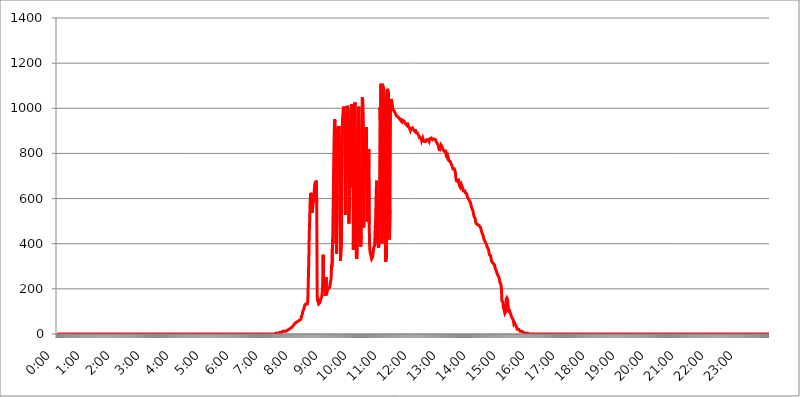
| Category | 2016.12.07. Intenzitás [W/m^2] |
|---|---|
| 0.0 | 0 |
| 0.0006944444444444445 | 0 |
| 0.001388888888888889 | 0 |
| 0.0020833333333333333 | 0 |
| 0.002777777777777778 | 0 |
| 0.003472222222222222 | 0 |
| 0.004166666666666667 | 0 |
| 0.004861111111111111 | 0 |
| 0.005555555555555556 | 0 |
| 0.0062499999999999995 | 0 |
| 0.006944444444444444 | 0 |
| 0.007638888888888889 | 0 |
| 0.008333333333333333 | 0 |
| 0.009027777777777779 | 0 |
| 0.009722222222222222 | 0 |
| 0.010416666666666666 | 0 |
| 0.011111111111111112 | 0 |
| 0.011805555555555555 | 0 |
| 0.012499999999999999 | 0 |
| 0.013194444444444444 | 0 |
| 0.013888888888888888 | 0 |
| 0.014583333333333332 | 0 |
| 0.015277777777777777 | 0 |
| 0.015972222222222224 | 0 |
| 0.016666666666666666 | 0 |
| 0.017361111111111112 | 0 |
| 0.018055555555555557 | 0 |
| 0.01875 | 0 |
| 0.019444444444444445 | 0 |
| 0.02013888888888889 | 0 |
| 0.020833333333333332 | 0 |
| 0.02152777777777778 | 0 |
| 0.022222222222222223 | 0 |
| 0.02291666666666667 | 0 |
| 0.02361111111111111 | 0 |
| 0.024305555555555556 | 0 |
| 0.024999999999999998 | 0 |
| 0.025694444444444447 | 0 |
| 0.02638888888888889 | 0 |
| 0.027083333333333334 | 0 |
| 0.027777777777777776 | 0 |
| 0.02847222222222222 | 0 |
| 0.029166666666666664 | 0 |
| 0.029861111111111113 | 0 |
| 0.030555555555555555 | 0 |
| 0.03125 | 0 |
| 0.03194444444444445 | 0 |
| 0.03263888888888889 | 0 |
| 0.03333333333333333 | 0 |
| 0.034027777777777775 | 0 |
| 0.034722222222222224 | 0 |
| 0.035416666666666666 | 0 |
| 0.036111111111111115 | 0 |
| 0.03680555555555556 | 0 |
| 0.0375 | 0 |
| 0.03819444444444444 | 0 |
| 0.03888888888888889 | 0 |
| 0.03958333333333333 | 0 |
| 0.04027777777777778 | 0 |
| 0.04097222222222222 | 0 |
| 0.041666666666666664 | 0 |
| 0.042361111111111106 | 0 |
| 0.04305555555555556 | 0 |
| 0.043750000000000004 | 0 |
| 0.044444444444444446 | 0 |
| 0.04513888888888889 | 0 |
| 0.04583333333333334 | 0 |
| 0.04652777777777778 | 0 |
| 0.04722222222222222 | 0 |
| 0.04791666666666666 | 0 |
| 0.04861111111111111 | 0 |
| 0.049305555555555554 | 0 |
| 0.049999999999999996 | 0 |
| 0.05069444444444445 | 0 |
| 0.051388888888888894 | 0 |
| 0.052083333333333336 | 0 |
| 0.05277777777777778 | 0 |
| 0.05347222222222222 | 0 |
| 0.05416666666666667 | 0 |
| 0.05486111111111111 | 0 |
| 0.05555555555555555 | 0 |
| 0.05625 | 0 |
| 0.05694444444444444 | 0 |
| 0.057638888888888885 | 0 |
| 0.05833333333333333 | 0 |
| 0.05902777777777778 | 0 |
| 0.059722222222222225 | 0 |
| 0.06041666666666667 | 0 |
| 0.061111111111111116 | 0 |
| 0.06180555555555556 | 0 |
| 0.0625 | 0 |
| 0.06319444444444444 | 0 |
| 0.06388888888888888 | 0 |
| 0.06458333333333334 | 0 |
| 0.06527777777777778 | 0 |
| 0.06597222222222222 | 0 |
| 0.06666666666666667 | 0 |
| 0.06736111111111111 | 0 |
| 0.06805555555555555 | 0 |
| 0.06874999999999999 | 0 |
| 0.06944444444444443 | 0 |
| 0.07013888888888889 | 0 |
| 0.07083333333333333 | 0 |
| 0.07152777777777779 | 0 |
| 0.07222222222222223 | 0 |
| 0.07291666666666667 | 0 |
| 0.07361111111111111 | 0 |
| 0.07430555555555556 | 0 |
| 0.075 | 0 |
| 0.07569444444444444 | 0 |
| 0.0763888888888889 | 0 |
| 0.07708333333333334 | 0 |
| 0.07777777777777778 | 0 |
| 0.07847222222222222 | 0 |
| 0.07916666666666666 | 0 |
| 0.0798611111111111 | 0 |
| 0.08055555555555556 | 0 |
| 0.08125 | 0 |
| 0.08194444444444444 | 0 |
| 0.08263888888888889 | 0 |
| 0.08333333333333333 | 0 |
| 0.08402777777777777 | 0 |
| 0.08472222222222221 | 0 |
| 0.08541666666666665 | 0 |
| 0.08611111111111112 | 0 |
| 0.08680555555555557 | 0 |
| 0.08750000000000001 | 0 |
| 0.08819444444444445 | 0 |
| 0.08888888888888889 | 0 |
| 0.08958333333333333 | 0 |
| 0.09027777777777778 | 0 |
| 0.09097222222222222 | 0 |
| 0.09166666666666667 | 0 |
| 0.09236111111111112 | 0 |
| 0.09305555555555556 | 0 |
| 0.09375 | 0 |
| 0.09444444444444444 | 0 |
| 0.09513888888888888 | 0 |
| 0.09583333333333333 | 0 |
| 0.09652777777777777 | 0 |
| 0.09722222222222222 | 0 |
| 0.09791666666666667 | 0 |
| 0.09861111111111111 | 0 |
| 0.09930555555555555 | 0 |
| 0.09999999999999999 | 0 |
| 0.10069444444444443 | 0 |
| 0.1013888888888889 | 0 |
| 0.10208333333333335 | 0 |
| 0.10277777777777779 | 0 |
| 0.10347222222222223 | 0 |
| 0.10416666666666667 | 0 |
| 0.10486111111111111 | 0 |
| 0.10555555555555556 | 0 |
| 0.10625 | 0 |
| 0.10694444444444444 | 0 |
| 0.1076388888888889 | 0 |
| 0.10833333333333334 | 0 |
| 0.10902777777777778 | 0 |
| 0.10972222222222222 | 0 |
| 0.1111111111111111 | 0 |
| 0.11180555555555556 | 0 |
| 0.11180555555555556 | 0 |
| 0.1125 | 0 |
| 0.11319444444444444 | 0 |
| 0.11388888888888889 | 0 |
| 0.11458333333333333 | 0 |
| 0.11527777777777777 | 0 |
| 0.11597222222222221 | 0 |
| 0.11666666666666665 | 0 |
| 0.1173611111111111 | 0 |
| 0.11805555555555557 | 0 |
| 0.11944444444444445 | 0 |
| 0.12013888888888889 | 0 |
| 0.12083333333333333 | 0 |
| 0.12152777777777778 | 0 |
| 0.12222222222222223 | 0 |
| 0.12291666666666667 | 0 |
| 0.12291666666666667 | 0 |
| 0.12361111111111112 | 0 |
| 0.12430555555555556 | 0 |
| 0.125 | 0 |
| 0.12569444444444444 | 0 |
| 0.12638888888888888 | 0 |
| 0.12708333333333333 | 0 |
| 0.16875 | 0 |
| 0.12847222222222224 | 0 |
| 0.12916666666666668 | 0 |
| 0.12986111111111112 | 0 |
| 0.13055555555555556 | 0 |
| 0.13125 | 0 |
| 0.13194444444444445 | 0 |
| 0.1326388888888889 | 0 |
| 0.13333333333333333 | 0 |
| 0.13402777777777777 | 0 |
| 0.13402777777777777 | 0 |
| 0.13472222222222222 | 0 |
| 0.13541666666666666 | 0 |
| 0.1361111111111111 | 0 |
| 0.13749999999999998 | 0 |
| 0.13819444444444443 | 0 |
| 0.1388888888888889 | 0 |
| 0.13958333333333334 | 0 |
| 0.14027777777777778 | 0 |
| 0.14097222222222222 | 0 |
| 0.14166666666666666 | 0 |
| 0.1423611111111111 | 0 |
| 0.14305555555555557 | 0 |
| 0.14375000000000002 | 0 |
| 0.14444444444444446 | 0 |
| 0.1451388888888889 | 0 |
| 0.1451388888888889 | 0 |
| 0.14652777777777778 | 0 |
| 0.14722222222222223 | 0 |
| 0.14791666666666667 | 0 |
| 0.1486111111111111 | 0 |
| 0.14930555555555555 | 0 |
| 0.15 | 0 |
| 0.15069444444444444 | 0 |
| 0.15138888888888888 | 0 |
| 0.15208333333333332 | 0 |
| 0.15277777777777776 | 0 |
| 0.15347222222222223 | 0 |
| 0.15416666666666667 | 0 |
| 0.15486111111111112 | 0 |
| 0.15555555555555556 | 0 |
| 0.15625 | 0 |
| 0.15694444444444444 | 0 |
| 0.15763888888888888 | 0 |
| 0.15833333333333333 | 0 |
| 0.15902777777777777 | 0 |
| 0.15972222222222224 | 0 |
| 0.16041666666666668 | 0 |
| 0.16111111111111112 | 0 |
| 0.16180555555555556 | 0 |
| 0.1625 | 0 |
| 0.16319444444444445 | 0 |
| 0.1638888888888889 | 0 |
| 0.16458333333333333 | 0 |
| 0.16527777777777777 | 0 |
| 0.16597222222222222 | 0 |
| 0.16666666666666666 | 0 |
| 0.1673611111111111 | 0 |
| 0.16805555555555554 | 0 |
| 0.16874999999999998 | 0 |
| 0.16944444444444443 | 0 |
| 0.17013888888888887 | 0 |
| 0.1708333333333333 | 0 |
| 0.17152777777777775 | 0 |
| 0.17222222222222225 | 0 |
| 0.1729166666666667 | 0 |
| 0.17361111111111113 | 0 |
| 0.17430555555555557 | 0 |
| 0.17500000000000002 | 0 |
| 0.17569444444444446 | 0 |
| 0.1763888888888889 | 0 |
| 0.17708333333333334 | 0 |
| 0.17777777777777778 | 0 |
| 0.17847222222222223 | 0 |
| 0.17916666666666667 | 0 |
| 0.1798611111111111 | 0 |
| 0.18055555555555555 | 0 |
| 0.18125 | 0 |
| 0.18194444444444444 | 0 |
| 0.1826388888888889 | 0 |
| 0.18333333333333335 | 0 |
| 0.1840277777777778 | 0 |
| 0.18472222222222223 | 0 |
| 0.18541666666666667 | 0 |
| 0.18611111111111112 | 0 |
| 0.18680555555555556 | 0 |
| 0.1875 | 0 |
| 0.18819444444444444 | 0 |
| 0.18888888888888888 | 0 |
| 0.18958333333333333 | 0 |
| 0.19027777777777777 | 0 |
| 0.1909722222222222 | 0 |
| 0.19166666666666665 | 0 |
| 0.19236111111111112 | 0 |
| 0.19305555555555554 | 0 |
| 0.19375 | 0 |
| 0.19444444444444445 | 0 |
| 0.1951388888888889 | 0 |
| 0.19583333333333333 | 0 |
| 0.19652777777777777 | 0 |
| 0.19722222222222222 | 0 |
| 0.19791666666666666 | 0 |
| 0.1986111111111111 | 0 |
| 0.19930555555555554 | 0 |
| 0.19999999999999998 | 0 |
| 0.20069444444444443 | 0 |
| 0.20138888888888887 | 0 |
| 0.2020833333333333 | 0 |
| 0.2027777777777778 | 0 |
| 0.2034722222222222 | 0 |
| 0.2041666666666667 | 0 |
| 0.20486111111111113 | 0 |
| 0.20555555555555557 | 0 |
| 0.20625000000000002 | 0 |
| 0.20694444444444446 | 0 |
| 0.2076388888888889 | 0 |
| 0.20833333333333334 | 0 |
| 0.20902777777777778 | 0 |
| 0.20972222222222223 | 0 |
| 0.21041666666666667 | 0 |
| 0.2111111111111111 | 0 |
| 0.21180555555555555 | 0 |
| 0.2125 | 0 |
| 0.21319444444444444 | 0 |
| 0.2138888888888889 | 0 |
| 0.21458333333333335 | 0 |
| 0.2152777777777778 | 0 |
| 0.21597222222222223 | 0 |
| 0.21666666666666667 | 0 |
| 0.21736111111111112 | 0 |
| 0.21805555555555556 | 0 |
| 0.21875 | 0 |
| 0.21944444444444444 | 0 |
| 0.22013888888888888 | 0 |
| 0.22083333333333333 | 0 |
| 0.22152777777777777 | 0 |
| 0.2222222222222222 | 0 |
| 0.22291666666666665 | 0 |
| 0.2236111111111111 | 0 |
| 0.22430555555555556 | 0 |
| 0.225 | 0 |
| 0.22569444444444445 | 0 |
| 0.2263888888888889 | 0 |
| 0.22708333333333333 | 0 |
| 0.22777777777777777 | 0 |
| 0.22847222222222222 | 0 |
| 0.22916666666666666 | 0 |
| 0.2298611111111111 | 0 |
| 0.23055555555555554 | 0 |
| 0.23124999999999998 | 0 |
| 0.23194444444444443 | 0 |
| 0.23263888888888887 | 0 |
| 0.2333333333333333 | 0 |
| 0.2340277777777778 | 0 |
| 0.2347222222222222 | 0 |
| 0.2354166666666667 | 0 |
| 0.23611111111111113 | 0 |
| 0.23680555555555557 | 0 |
| 0.23750000000000002 | 0 |
| 0.23819444444444446 | 0 |
| 0.2388888888888889 | 0 |
| 0.23958333333333334 | 0 |
| 0.24027777777777778 | 0 |
| 0.24097222222222223 | 0 |
| 0.24166666666666667 | 0 |
| 0.2423611111111111 | 0 |
| 0.24305555555555555 | 0 |
| 0.24375 | 0 |
| 0.24444444444444446 | 0 |
| 0.24513888888888888 | 0 |
| 0.24583333333333335 | 0 |
| 0.2465277777777778 | 0 |
| 0.24722222222222223 | 0 |
| 0.24791666666666667 | 0 |
| 0.24861111111111112 | 0 |
| 0.24930555555555556 | 0 |
| 0.25 | 0 |
| 0.25069444444444444 | 0 |
| 0.2513888888888889 | 0 |
| 0.2520833333333333 | 0 |
| 0.25277777777777777 | 0 |
| 0.2534722222222222 | 0 |
| 0.25416666666666665 | 0 |
| 0.2548611111111111 | 0 |
| 0.2555555555555556 | 0 |
| 0.25625000000000003 | 0 |
| 0.2569444444444445 | 0 |
| 0.2576388888888889 | 0 |
| 0.25833333333333336 | 0 |
| 0.2590277777777778 | 0 |
| 0.25972222222222224 | 0 |
| 0.2604166666666667 | 0 |
| 0.2611111111111111 | 0 |
| 0.26180555555555557 | 0 |
| 0.2625 | 0 |
| 0.26319444444444445 | 0 |
| 0.2638888888888889 | 0 |
| 0.26458333333333334 | 0 |
| 0.2652777777777778 | 0 |
| 0.2659722222222222 | 0 |
| 0.26666666666666666 | 0 |
| 0.2673611111111111 | 0 |
| 0.26805555555555555 | 0 |
| 0.26875 | 0 |
| 0.26944444444444443 | 0 |
| 0.2701388888888889 | 0 |
| 0.2708333333333333 | 0 |
| 0.27152777777777776 | 0 |
| 0.2722222222222222 | 0 |
| 0.27291666666666664 | 0 |
| 0.2736111111111111 | 0 |
| 0.2743055555555555 | 0 |
| 0.27499999999999997 | 0 |
| 0.27569444444444446 | 0 |
| 0.27638888888888885 | 0 |
| 0.27708333333333335 | 0 |
| 0.2777777777777778 | 0 |
| 0.27847222222222223 | 0 |
| 0.2791666666666667 | 0 |
| 0.2798611111111111 | 0 |
| 0.28055555555555556 | 0 |
| 0.28125 | 0 |
| 0.28194444444444444 | 0 |
| 0.2826388888888889 | 0 |
| 0.2833333333333333 | 0 |
| 0.28402777777777777 | 0 |
| 0.2847222222222222 | 0 |
| 0.28541666666666665 | 0 |
| 0.28611111111111115 | 0 |
| 0.28680555555555554 | 0 |
| 0.28750000000000003 | 0 |
| 0.2881944444444445 | 0 |
| 0.2888888888888889 | 0 |
| 0.28958333333333336 | 0 |
| 0.2902777777777778 | 0 |
| 0.29097222222222224 | 0 |
| 0.2916666666666667 | 0 |
| 0.2923611111111111 | 0 |
| 0.29305555555555557 | 0 |
| 0.29375 | 0 |
| 0.29444444444444445 | 0 |
| 0.2951388888888889 | 0 |
| 0.29583333333333334 | 0 |
| 0.2965277777777778 | 0 |
| 0.2972222222222222 | 0 |
| 0.29791666666666666 | 0 |
| 0.2986111111111111 | 0 |
| 0.29930555555555555 | 0 |
| 0.3 | 0 |
| 0.30069444444444443 | 0 |
| 0.3013888888888889 | 0 |
| 0.3020833333333333 | 0 |
| 0.30277777777777776 | 0 |
| 0.3034722222222222 | 0 |
| 0.30416666666666664 | 0 |
| 0.3048611111111111 | 3.525 |
| 0.3055555555555555 | 3.525 |
| 0.30624999999999997 | 3.525 |
| 0.3069444444444444 | 3.525 |
| 0.3076388888888889 | 3.525 |
| 0.30833333333333335 | 3.525 |
| 0.3090277777777778 | 3.525 |
| 0.30972222222222223 | 3.525 |
| 0.3104166666666667 | 3.525 |
| 0.3111111111111111 | 3.525 |
| 0.31180555555555556 | 3.525 |
| 0.3125 | 7.887 |
| 0.31319444444444444 | 7.887 |
| 0.3138888888888889 | 7.887 |
| 0.3145833333333333 | 7.887 |
| 0.31527777777777777 | 12.257 |
| 0.3159722222222222 | 12.257 |
| 0.31666666666666665 | 12.257 |
| 0.31736111111111115 | 12.257 |
| 0.31805555555555554 | 12.257 |
| 0.31875000000000003 | 12.257 |
| 0.3194444444444445 | 12.257 |
| 0.3201388888888889 | 12.257 |
| 0.32083333333333336 | 12.257 |
| 0.3215277777777778 | 16.636 |
| 0.32222222222222224 | 16.636 |
| 0.3229166666666667 | 16.636 |
| 0.3236111111111111 | 21.024 |
| 0.32430555555555557 | 21.024 |
| 0.325 | 21.024 |
| 0.32569444444444445 | 21.024 |
| 0.3263888888888889 | 25.419 |
| 0.32708333333333334 | 25.419 |
| 0.3277777777777778 | 29.823 |
| 0.3284722222222222 | 29.823 |
| 0.32916666666666666 | 29.823 |
| 0.3298611111111111 | 29.823 |
| 0.33055555555555555 | 34.234 |
| 0.33125 | 38.653 |
| 0.33194444444444443 | 38.653 |
| 0.3326388888888889 | 43.079 |
| 0.3333333333333333 | 47.511 |
| 0.3340277777777778 | 47.511 |
| 0.3347222222222222 | 47.511 |
| 0.3354166666666667 | 51.951 |
| 0.3361111111111111 | 51.951 |
| 0.3368055555555556 | 51.951 |
| 0.33749999999999997 | 56.398 |
| 0.33819444444444446 | 56.398 |
| 0.33888888888888885 | 56.398 |
| 0.33958333333333335 | 60.85 |
| 0.34027777777777773 | 60.85 |
| 0.34097222222222223 | 60.85 |
| 0.3416666666666666 | 65.31 |
| 0.3423611111111111 | 74.246 |
| 0.3430555555555555 | 83.205 |
| 0.34375 | 87.692 |
| 0.3444444444444445 | 101.184 |
| 0.3451388888888889 | 105.69 |
| 0.3458333333333334 | 110.201 |
| 0.34652777777777777 | 119.235 |
| 0.34722222222222227 | 128.284 |
| 0.34791666666666665 | 128.284 |
| 0.34861111111111115 | 132.814 |
| 0.34930555555555554 | 132.814 |
| 0.35000000000000003 | 132.814 |
| 0.3506944444444444 | 132.814 |
| 0.3513888888888889 | 146.423 |
| 0.3520833333333333 | 233 |
| 0.3527777777777778 | 324.052 |
| 0.3534722222222222 | 449.551 |
| 0.3541666666666667 | 515.223 |
| 0.3548611111111111 | 600.661 |
| 0.35555555555555557 | 625.784 |
| 0.35625 | 625.784 |
| 0.35694444444444445 | 604.864 |
| 0.3576388888888889 | 536.82 |
| 0.35833333333333334 | 566.793 |
| 0.3590277777777778 | 571.049 |
| 0.3597222222222222 | 592.233 |
| 0.36041666666666666 | 634.105 |
| 0.3611111111111111 | 658.909 |
| 0.36180555555555555 | 671.22 |
| 0.3625 | 663.019 |
| 0.36319444444444443 | 679.395 |
| 0.3638888888888889 | 583.779 |
| 0.3645833333333333 | 169.156 |
| 0.3652777777777778 | 146.423 |
| 0.3659722222222222 | 141.884 |
| 0.3666666666666667 | 132.814 |
| 0.3673611111111111 | 132.814 |
| 0.3680555555555556 | 137.347 |
| 0.36874999999999997 | 141.884 |
| 0.36944444444444446 | 155.509 |
| 0.37013888888888885 | 160.056 |
| 0.37083333333333335 | 164.605 |
| 0.37152777777777773 | 178.264 |
| 0.37222222222222223 | 219.309 |
| 0.3729166666666666 | 351.198 |
| 0.3736111111111111 | 233 |
| 0.3743055555555555 | 233 |
| 0.375 | 219.309 |
| 0.3756944444444445 | 169.156 |
| 0.3763888888888889 | 191.937 |
| 0.3770833333333334 | 251.251 |
| 0.37777777777777777 | 191.937 |
| 0.37847222222222227 | 187.378 |
| 0.37916666666666665 | 196.497 |
| 0.37986111111111115 | 201.058 |
| 0.38055555555555554 | 201.058 |
| 0.38125000000000003 | 201.058 |
| 0.3819444444444444 | 205.62 |
| 0.3826388888888889 | 219.309 |
| 0.3833333333333333 | 233 |
| 0.3840277777777778 | 242.127 |
| 0.3847222222222222 | 305.898 |
| 0.3854166666666667 | 296.808 |
| 0.3861111111111111 | 418.492 |
| 0.38680555555555557 | 400.638 |
| 0.3875 | 699.717 |
| 0.38819444444444445 | 845.365 |
| 0.3888888888888889 | 951.327 |
| 0.38958333333333334 | 943.832 |
| 0.3902777777777778 | 898.668 |
| 0.3909722222222222 | 575.299 |
| 0.39166666666666666 | 355.712 |
| 0.3923611111111111 | 621.613 |
| 0.39305555555555555 | 783.342 |
| 0.39375 | 909.996 |
| 0.39444444444444443 | 894.885 |
| 0.3951388888888889 | 921.298 |
| 0.3958333333333333 | 810.641 |
| 0.3965277777777778 | 506.542 |
| 0.3972222222222222 | 324.052 |
| 0.3979166666666667 | 324.052 |
| 0.3986111111111111 | 422.943 |
| 0.3993055555555556 | 703.762 |
| 0.39999999999999997 | 947.58 |
| 0.40069444444444446 | 973.772 |
| 0.40138888888888885 | 1007.383 |
| 0.40208333333333335 | 999.916 |
| 0.40277777777777773 | 973.772 |
| 0.40347222222222223 | 829.981 |
| 0.4041666666666666 | 528.2 |
| 0.4048611111111111 | 829.981 |
| 0.4055555555555555 | 917.534 |
| 0.40625 | 1011.118 |
| 0.4069444444444445 | 1011.118 |
| 0.4076388888888889 | 999.916 |
| 0.4083333333333334 | 810.641 |
| 0.40902777777777777 | 489.108 |
| 0.40972222222222227 | 604.864 |
| 0.41041666666666665 | 751.803 |
| 0.41111111111111115 | 650.667 |
| 0.41180555555555554 | 992.448 |
| 0.41250000000000003 | 1018.587 |
| 0.4131944444444444 | 999.916 |
| 0.4138888888888889 | 1018.587 |
| 0.4145833333333333 | 802.868 |
| 0.4152777777777778 | 373.729 |
| 0.4159722222222222 | 600.661 |
| 0.4166666666666667 | 984.98 |
| 0.4173611111111111 | 1026.06 |
| 0.41805555555555557 | 1018.587 |
| 0.41875 | 506.542 |
| 0.41944444444444445 | 342.162 |
| 0.4201388888888889 | 333.113 |
| 0.42083333333333334 | 427.39 |
| 0.4215277777777778 | 571.049 |
| 0.4222222222222222 | 936.33 |
| 0.42291666666666666 | 1007.383 |
| 0.4236111111111111 | 853.029 |
| 0.42430555555555555 | 427.39 |
| 0.425 | 396.164 |
| 0.42569444444444443 | 387.202 |
| 0.4263888888888889 | 436.27 |
| 0.4270833333333333 | 767.62 |
| 0.4277777777777778 | 1048.508 |
| 0.4284722222222222 | 1037.277 |
| 0.4291666666666667 | 958.814 |
| 0.4298611111111111 | 471.582 |
| 0.4305555555555556 | 707.8 |
| 0.43124999999999997 | 891.099 |
| 0.43194444444444446 | 818.392 |
| 0.43263888888888885 | 727.896 |
| 0.43333333333333335 | 917.534 |
| 0.43402777777777773 | 739.877 |
| 0.43472222222222223 | 497.836 |
| 0.4354166666666666 | 634.105 |
| 0.4361111111111111 | 506.542 |
| 0.4368055555555555 | 818.392 |
| 0.4375 | 489.108 |
| 0.4381944444444445 | 382.715 |
| 0.4388888888888889 | 360.221 |
| 0.4395833333333334 | 351.198 |
| 0.44027777777777777 | 342.162 |
| 0.44097222222222227 | 333.113 |
| 0.44166666666666665 | 333.113 |
| 0.44236111111111115 | 342.162 |
| 0.44305555555555554 | 360.221 |
| 0.44375000000000003 | 382.715 |
| 0.4444444444444444 | 382.715 |
| 0.4451388888888889 | 391.685 |
| 0.4458333333333333 | 458.38 |
| 0.4465277777777778 | 506.542 |
| 0.4472222222222222 | 609.062 |
| 0.4479166666666667 | 679.395 |
| 0.4486111111111111 | 458.38 |
| 0.44930555555555557 | 405.108 |
| 0.45 | 391.685 |
| 0.45069444444444445 | 382.715 |
| 0.4513888888888889 | 418.492 |
| 0.45208333333333334 | 604.864 |
| 0.4527777777777778 | 1003.65 |
| 0.4534722222222222 | 909.996 |
| 0.45416666666666666 | 1108.816 |
| 0.4548611111111111 | 497.836 |
| 0.45555555555555555 | 400.638 |
| 0.45625 | 532.513 |
| 0.45694444444444443 | 1082.324 |
| 0.4576388888888889 | 1089.873 |
| 0.4583333333333333 | 1082.324 |
| 0.4590277777777778 | 1037.277 |
| 0.4597222222222222 | 707.8 |
| 0.4604166666666667 | 319.517 |
| 0.4611111111111111 | 319.517 |
| 0.4618055555555556 | 342.162 |
| 0.46249999999999997 | 731.896 |
| 0.46319444444444446 | 1086.097 |
| 0.46388888888888885 | 1082.324 |
| 0.46458333333333335 | 1063.51 |
| 0.46527777777777773 | 462.786 |
| 0.46597222222222223 | 418.492 |
| 0.4666666666666666 | 553.986 |
| 0.4673611111111111 | 984.98 |
| 0.4680555555555555 | 1041.019 |
| 0.46875 | 1037.277 |
| 0.4694444444444445 | 1026.06 |
| 0.4701388888888889 | 1011.118 |
| 0.4708333333333334 | 996.182 |
| 0.47152777777777777 | 992.448 |
| 0.47222222222222227 | 988.714 |
| 0.47291666666666665 | 984.98 |
| 0.47361111111111115 | 981.244 |
| 0.47430555555555554 | 981.244 |
| 0.47500000000000003 | 977.508 |
| 0.4756944444444444 | 966.295 |
| 0.4763888888888889 | 962.555 |
| 0.4770833333333333 | 966.295 |
| 0.4777777777777778 | 962.555 |
| 0.4784722222222222 | 958.814 |
| 0.4791666666666667 | 958.814 |
| 0.4798611111111111 | 955.071 |
| 0.48055555555555557 | 951.327 |
| 0.48125 | 947.58 |
| 0.48194444444444445 | 951.327 |
| 0.4826388888888889 | 951.327 |
| 0.48333333333333334 | 940.082 |
| 0.4840277777777778 | 947.58 |
| 0.4847222222222222 | 947.58 |
| 0.48541666666666666 | 947.58 |
| 0.4861111111111111 | 943.832 |
| 0.48680555555555555 | 943.832 |
| 0.4875 | 940.082 |
| 0.48819444444444443 | 932.576 |
| 0.4888888888888889 | 936.33 |
| 0.4895833333333333 | 928.819 |
| 0.4902777777777778 | 925.06 |
| 0.4909722222222222 | 936.33 |
| 0.4916666666666667 | 932.576 |
| 0.4923611111111111 | 921.298 |
| 0.4930555555555556 | 917.534 |
| 0.49374999999999997 | 913.766 |
| 0.49444444444444446 | 913.766 |
| 0.49513888888888885 | 902.447 |
| 0.49583333333333335 | 909.996 |
| 0.49652777777777773 | 913.766 |
| 0.49722222222222223 | 913.766 |
| 0.4979166666666666 | 913.766 |
| 0.4986111111111111 | 913.766 |
| 0.4993055555555555 | 906.223 |
| 0.5 | 906.223 |
| 0.5006944444444444 | 902.447 |
| 0.5013888888888889 | 898.668 |
| 0.5020833333333333 | 906.223 |
| 0.5027777777777778 | 894.885 |
| 0.5034722222222222 | 898.668 |
| 0.5041666666666667 | 891.099 |
| 0.5048611111111111 | 891.099 |
| 0.5055555555555555 | 891.099 |
| 0.50625 | 883.516 |
| 0.5069444444444444 | 879.719 |
| 0.5076388888888889 | 879.719 |
| 0.5083333333333333 | 868.305 |
| 0.5090277777777777 | 864.493 |
| 0.5097222222222222 | 864.493 |
| 0.5104166666666666 | 868.305 |
| 0.5111111111111112 | 856.855 |
| 0.5118055555555555 | 853.029 |
| 0.5125000000000001 | 868.305 |
| 0.5131944444444444 | 860.676 |
| 0.513888888888889 | 860.676 |
| 0.5145833333333333 | 853.029 |
| 0.5152777777777778 | 853.029 |
| 0.5159722222222222 | 856.855 |
| 0.5166666666666667 | 853.029 |
| 0.517361111111111 | 856.855 |
| 0.5180555555555556 | 860.676 |
| 0.5187499999999999 | 860.676 |
| 0.5194444444444445 | 864.493 |
| 0.5201388888888888 | 860.676 |
| 0.5208333333333334 | 860.676 |
| 0.5215277777777778 | 853.029 |
| 0.5222222222222223 | 864.493 |
| 0.5229166666666667 | 860.676 |
| 0.5236111111111111 | 868.305 |
| 0.5243055555555556 | 868.305 |
| 0.525 | 868.305 |
| 0.5256944444444445 | 868.305 |
| 0.5263888888888889 | 860.676 |
| 0.5270833333333333 | 860.676 |
| 0.5277777777777778 | 864.493 |
| 0.5284722222222222 | 864.493 |
| 0.5291666666666667 | 860.676 |
| 0.5298611111111111 | 860.676 |
| 0.5305555555555556 | 860.676 |
| 0.53125 | 853.029 |
| 0.5319444444444444 | 849.199 |
| 0.5326388888888889 | 845.365 |
| 0.5333333333333333 | 849.199 |
| 0.5340277777777778 | 837.682 |
| 0.5347222222222222 | 829.981 |
| 0.5354166666666667 | 829.981 |
| 0.5361111111111111 | 810.641 |
| 0.5368055555555555 | 822.26 |
| 0.5375 | 829.981 |
| 0.5381944444444444 | 837.682 |
| 0.5388888888888889 | 833.834 |
| 0.5395833333333333 | 829.981 |
| 0.5402777777777777 | 822.26 |
| 0.5409722222222222 | 818.392 |
| 0.5416666666666666 | 818.392 |
| 0.5423611111111112 | 810.641 |
| 0.5430555555555555 | 806.757 |
| 0.5437500000000001 | 814.519 |
| 0.5444444444444444 | 810.641 |
| 0.545138888888889 | 798.974 |
| 0.5458333333333333 | 787.258 |
| 0.5465277777777778 | 783.342 |
| 0.5472222222222222 | 779.42 |
| 0.5479166666666667 | 787.258 |
| 0.548611111111111 | 779.42 |
| 0.5493055555555556 | 767.62 |
| 0.5499999999999999 | 763.674 |
| 0.5506944444444445 | 767.62 |
| 0.5513888888888888 | 763.674 |
| 0.5520833333333334 | 755.766 |
| 0.5527777777777778 | 751.803 |
| 0.5534722222222223 | 747.834 |
| 0.5541666666666667 | 739.877 |
| 0.5548611111111111 | 731.896 |
| 0.5555555555555556 | 735.89 |
| 0.55625 | 735.89 |
| 0.5569444444444445 | 731.896 |
| 0.5576388888888889 | 727.896 |
| 0.5583333333333333 | 715.858 |
| 0.5590277777777778 | 695.666 |
| 0.5597222222222222 | 679.395 |
| 0.5604166666666667 | 683.473 |
| 0.5611111111111111 | 675.311 |
| 0.5618055555555556 | 675.311 |
| 0.5625 | 687.544 |
| 0.5631944444444444 | 675.311 |
| 0.5638888888888889 | 658.909 |
| 0.5645833333333333 | 658.909 |
| 0.5652777777777778 | 650.667 |
| 0.5659722222222222 | 650.667 |
| 0.5666666666666667 | 663.019 |
| 0.5673611111111111 | 658.909 |
| 0.5680555555555555 | 650.667 |
| 0.56875 | 642.4 |
| 0.5694444444444444 | 634.105 |
| 0.5701388888888889 | 638.256 |
| 0.5708333333333333 | 634.105 |
| 0.5715277777777777 | 634.105 |
| 0.5722222222222222 | 625.784 |
| 0.5729166666666666 | 621.613 |
| 0.5736111111111112 | 621.613 |
| 0.5743055555555555 | 621.613 |
| 0.5750000000000001 | 609.062 |
| 0.5756944444444444 | 604.864 |
| 0.576388888888889 | 600.661 |
| 0.5770833333333333 | 600.661 |
| 0.5777777777777778 | 592.233 |
| 0.5784722222222222 | 592.233 |
| 0.5791666666666667 | 592.233 |
| 0.579861111111111 | 579.542 |
| 0.5805555555555556 | 566.793 |
| 0.5812499999999999 | 558.261 |
| 0.5819444444444445 | 553.986 |
| 0.5826388888888888 | 549.704 |
| 0.5833333333333334 | 541.121 |
| 0.5840277777777778 | 528.2 |
| 0.5847222222222223 | 519.555 |
| 0.5854166666666667 | 515.223 |
| 0.5861111111111111 | 510.885 |
| 0.5868055555555556 | 497.836 |
| 0.5875 | 489.108 |
| 0.5881944444444445 | 489.108 |
| 0.5888888888888889 | 489.108 |
| 0.5895833333333333 | 484.735 |
| 0.5902777777777778 | 484.735 |
| 0.5909722222222222 | 484.735 |
| 0.5916666666666667 | 480.356 |
| 0.5923611111111111 | 480.356 |
| 0.5930555555555556 | 475.972 |
| 0.59375 | 471.582 |
| 0.5944444444444444 | 462.786 |
| 0.5951388888888889 | 453.968 |
| 0.5958333333333333 | 449.551 |
| 0.5965277777777778 | 440.702 |
| 0.5972222222222222 | 436.27 |
| 0.5979166666666667 | 436.27 |
| 0.5986111111111111 | 418.492 |
| 0.5993055555555555 | 414.035 |
| 0.6 | 409.574 |
| 0.6006944444444444 | 405.108 |
| 0.6013888888888889 | 400.638 |
| 0.6020833333333333 | 396.164 |
| 0.6027777777777777 | 387.202 |
| 0.6034722222222222 | 387.202 |
| 0.6041666666666666 | 378.224 |
| 0.6048611111111112 | 373.729 |
| 0.6055555555555555 | 360.221 |
| 0.6062500000000001 | 351.198 |
| 0.6069444444444444 | 351.198 |
| 0.607638888888889 | 346.682 |
| 0.6083333333333333 | 337.639 |
| 0.6090277777777778 | 324.052 |
| 0.6097222222222222 | 319.517 |
| 0.6104166666666667 | 319.517 |
| 0.611111111111111 | 314.98 |
| 0.6118055555555556 | 314.98 |
| 0.6124999999999999 | 314.98 |
| 0.6131944444444445 | 305.898 |
| 0.6138888888888888 | 296.808 |
| 0.6145833333333334 | 287.709 |
| 0.6152777777777778 | 283.156 |
| 0.6159722222222223 | 278.603 |
| 0.6166666666666667 | 269.49 |
| 0.6173611111111111 | 264.932 |
| 0.6180555555555556 | 260.373 |
| 0.61875 | 255.813 |
| 0.6194444444444445 | 251.251 |
| 0.6201388888888889 | 242.127 |
| 0.6208333333333333 | 228.436 |
| 0.6215277777777778 | 228.436 |
| 0.6222222222222222 | 219.309 |
| 0.6229166666666667 | 201.058 |
| 0.6236111111111111 | 146.423 |
| 0.6243055555555556 | 146.423 |
| 0.625 | 141.884 |
| 0.6256944444444444 | 119.235 |
| 0.6263888888888889 | 110.201 |
| 0.6270833333333333 | 110.201 |
| 0.6277777777777778 | 92.184 |
| 0.6284722222222222 | 92.184 |
| 0.6291666666666667 | 101.184 |
| 0.6298611111111111 | 155.509 |
| 0.6305555555555555 | 160.056 |
| 0.63125 | 155.509 |
| 0.6319444444444444 | 137.347 |
| 0.6326388888888889 | 114.716 |
| 0.6333333333333333 | 96.682 |
| 0.6340277777777777 | 110.201 |
| 0.6347222222222222 | 96.682 |
| 0.6354166666666666 | 92.184 |
| 0.6361111111111112 | 87.692 |
| 0.6368055555555555 | 78.722 |
| 0.6375000000000001 | 74.246 |
| 0.6381944444444444 | 74.246 |
| 0.638888888888889 | 65.31 |
| 0.6395833333333333 | 60.85 |
| 0.6402777777777778 | 47.511 |
| 0.6409722222222222 | 51.951 |
| 0.6416666666666667 | 51.951 |
| 0.642361111111111 | 43.079 |
| 0.6430555555555556 | 38.653 |
| 0.6437499999999999 | 38.653 |
| 0.6444444444444445 | 29.823 |
| 0.6451388888888888 | 21.024 |
| 0.6458333333333334 | 25.419 |
| 0.6465277777777778 | 21.024 |
| 0.6472222222222223 | 21.024 |
| 0.6479166666666667 | 16.636 |
| 0.6486111111111111 | 16.636 |
| 0.6493055555555556 | 12.257 |
| 0.65 | 12.257 |
| 0.6506944444444445 | 12.257 |
| 0.6513888888888889 | 12.257 |
| 0.6520833333333333 | 12.257 |
| 0.6527777777777778 | 7.887 |
| 0.6534722222222222 | 7.887 |
| 0.6541666666666667 | 7.887 |
| 0.6548611111111111 | 7.887 |
| 0.6555555555555556 | 3.525 |
| 0.65625 | 3.525 |
| 0.6569444444444444 | 3.525 |
| 0.6576388888888889 | 3.525 |
| 0.6583333333333333 | 3.525 |
| 0.6590277777777778 | 3.525 |
| 0.6597222222222222 | 3.525 |
| 0.6604166666666667 | 3.525 |
| 0.6611111111111111 | 0 |
| 0.6618055555555555 | 0 |
| 0.6625 | 0 |
| 0.6631944444444444 | 0 |
| 0.6638888888888889 | 0 |
| 0.6645833333333333 | 0 |
| 0.6652777777777777 | 0 |
| 0.6659722222222222 | 0 |
| 0.6666666666666666 | 0 |
| 0.6673611111111111 | 0 |
| 0.6680555555555556 | 0 |
| 0.6687500000000001 | 0 |
| 0.6694444444444444 | 0 |
| 0.6701388888888888 | 0 |
| 0.6708333333333334 | 0 |
| 0.6715277777777778 | 0 |
| 0.6722222222222222 | 0 |
| 0.6729166666666666 | 0 |
| 0.6736111111111112 | 0 |
| 0.6743055555555556 | 0 |
| 0.6749999999999999 | 0 |
| 0.6756944444444444 | 0 |
| 0.6763888888888889 | 0 |
| 0.6770833333333334 | 0 |
| 0.6777777777777777 | 0 |
| 0.6784722222222223 | 0 |
| 0.6791666666666667 | 0 |
| 0.6798611111111111 | 0 |
| 0.6805555555555555 | 0 |
| 0.68125 | 0 |
| 0.6819444444444445 | 0 |
| 0.6826388888888889 | 0 |
| 0.6833333333333332 | 0 |
| 0.6840277777777778 | 0 |
| 0.6847222222222222 | 0 |
| 0.6854166666666667 | 0 |
| 0.686111111111111 | 0 |
| 0.6868055555555556 | 0 |
| 0.6875 | 0 |
| 0.6881944444444444 | 0 |
| 0.688888888888889 | 0 |
| 0.6895833333333333 | 0 |
| 0.6902777777777778 | 0 |
| 0.6909722222222222 | 0 |
| 0.6916666666666668 | 0 |
| 0.6923611111111111 | 0 |
| 0.6930555555555555 | 0 |
| 0.69375 | 0 |
| 0.6944444444444445 | 0 |
| 0.6951388888888889 | 0 |
| 0.6958333333333333 | 0 |
| 0.6965277777777777 | 0 |
| 0.6972222222222223 | 0 |
| 0.6979166666666666 | 0 |
| 0.6986111111111111 | 0 |
| 0.6993055555555556 | 0 |
| 0.7000000000000001 | 0 |
| 0.7006944444444444 | 0 |
| 0.7013888888888888 | 0 |
| 0.7020833333333334 | 0 |
| 0.7027777777777778 | 0 |
| 0.7034722222222222 | 0 |
| 0.7041666666666666 | 0 |
| 0.7048611111111112 | 0 |
| 0.7055555555555556 | 0 |
| 0.7062499999999999 | 0 |
| 0.7069444444444444 | 0 |
| 0.7076388888888889 | 0 |
| 0.7083333333333334 | 0 |
| 0.7090277777777777 | 0 |
| 0.7097222222222223 | 0 |
| 0.7104166666666667 | 0 |
| 0.7111111111111111 | 0 |
| 0.7118055555555555 | 0 |
| 0.7125 | 0 |
| 0.7131944444444445 | 0 |
| 0.7138888888888889 | 0 |
| 0.7145833333333332 | 0 |
| 0.7152777777777778 | 0 |
| 0.7159722222222222 | 0 |
| 0.7166666666666667 | 0 |
| 0.717361111111111 | 0 |
| 0.7180555555555556 | 0 |
| 0.71875 | 0 |
| 0.7194444444444444 | 0 |
| 0.720138888888889 | 0 |
| 0.7208333333333333 | 0 |
| 0.7215277777777778 | 0 |
| 0.7222222222222222 | 0 |
| 0.7229166666666668 | 0 |
| 0.7236111111111111 | 0 |
| 0.7243055555555555 | 0 |
| 0.725 | 0 |
| 0.7256944444444445 | 0 |
| 0.7263888888888889 | 0 |
| 0.7270833333333333 | 0 |
| 0.7277777777777777 | 0 |
| 0.7284722222222223 | 0 |
| 0.7291666666666666 | 0 |
| 0.7298611111111111 | 0 |
| 0.7305555555555556 | 0 |
| 0.7312500000000001 | 0 |
| 0.7319444444444444 | 0 |
| 0.7326388888888888 | 0 |
| 0.7333333333333334 | 0 |
| 0.7340277777777778 | 0 |
| 0.7347222222222222 | 0 |
| 0.7354166666666666 | 0 |
| 0.7361111111111112 | 0 |
| 0.7368055555555556 | 0 |
| 0.7374999999999999 | 0 |
| 0.7381944444444444 | 0 |
| 0.7388888888888889 | 0 |
| 0.7395833333333334 | 0 |
| 0.7402777777777777 | 0 |
| 0.7409722222222223 | 0 |
| 0.7416666666666667 | 0 |
| 0.7423611111111111 | 0 |
| 0.7430555555555555 | 0 |
| 0.74375 | 0 |
| 0.7444444444444445 | 0 |
| 0.7451388888888889 | 0 |
| 0.7458333333333332 | 0 |
| 0.7465277777777778 | 0 |
| 0.7472222222222222 | 0 |
| 0.7479166666666667 | 0 |
| 0.748611111111111 | 0 |
| 0.7493055555555556 | 0 |
| 0.75 | 0 |
| 0.7506944444444444 | 0 |
| 0.751388888888889 | 0 |
| 0.7520833333333333 | 0 |
| 0.7527777777777778 | 0 |
| 0.7534722222222222 | 0 |
| 0.7541666666666668 | 0 |
| 0.7548611111111111 | 0 |
| 0.7555555555555555 | 0 |
| 0.75625 | 0 |
| 0.7569444444444445 | 0 |
| 0.7576388888888889 | 0 |
| 0.7583333333333333 | 0 |
| 0.7590277777777777 | 0 |
| 0.7597222222222223 | 0 |
| 0.7604166666666666 | 0 |
| 0.7611111111111111 | 0 |
| 0.7618055555555556 | 0 |
| 0.7625000000000001 | 0 |
| 0.7631944444444444 | 0 |
| 0.7638888888888888 | 0 |
| 0.7645833333333334 | 0 |
| 0.7652777777777778 | 0 |
| 0.7659722222222222 | 0 |
| 0.7666666666666666 | 0 |
| 0.7673611111111112 | 0 |
| 0.7680555555555556 | 0 |
| 0.7687499999999999 | 0 |
| 0.7694444444444444 | 0 |
| 0.7701388888888889 | 0 |
| 0.7708333333333334 | 0 |
| 0.7715277777777777 | 0 |
| 0.7722222222222223 | 0 |
| 0.7729166666666667 | 0 |
| 0.7736111111111111 | 0 |
| 0.7743055555555555 | 0 |
| 0.775 | 0 |
| 0.7756944444444445 | 0 |
| 0.7763888888888889 | 0 |
| 0.7770833333333332 | 0 |
| 0.7777777777777778 | 0 |
| 0.7784722222222222 | 0 |
| 0.7791666666666667 | 0 |
| 0.779861111111111 | 0 |
| 0.7805555555555556 | 0 |
| 0.78125 | 0 |
| 0.7819444444444444 | 0 |
| 0.782638888888889 | 0 |
| 0.7833333333333333 | 0 |
| 0.7840277777777778 | 0 |
| 0.7847222222222222 | 0 |
| 0.7854166666666668 | 0 |
| 0.7861111111111111 | 0 |
| 0.7868055555555555 | 0 |
| 0.7875 | 0 |
| 0.7881944444444445 | 0 |
| 0.7888888888888889 | 0 |
| 0.7895833333333333 | 0 |
| 0.7902777777777777 | 0 |
| 0.7909722222222223 | 0 |
| 0.7916666666666666 | 0 |
| 0.7923611111111111 | 0 |
| 0.7930555555555556 | 0 |
| 0.7937500000000001 | 0 |
| 0.7944444444444444 | 0 |
| 0.7951388888888888 | 0 |
| 0.7958333333333334 | 0 |
| 0.7965277777777778 | 0 |
| 0.7972222222222222 | 0 |
| 0.7979166666666666 | 0 |
| 0.7986111111111112 | 0 |
| 0.7993055555555556 | 0 |
| 0.7999999999999999 | 0 |
| 0.8006944444444444 | 0 |
| 0.8013888888888889 | 0 |
| 0.8020833333333334 | 0 |
| 0.8027777777777777 | 0 |
| 0.8034722222222223 | 0 |
| 0.8041666666666667 | 0 |
| 0.8048611111111111 | 0 |
| 0.8055555555555555 | 0 |
| 0.80625 | 0 |
| 0.8069444444444445 | 0 |
| 0.8076388888888889 | 0 |
| 0.8083333333333332 | 0 |
| 0.8090277777777778 | 0 |
| 0.8097222222222222 | 0 |
| 0.8104166666666667 | 0 |
| 0.811111111111111 | 0 |
| 0.8118055555555556 | 0 |
| 0.8125 | 0 |
| 0.8131944444444444 | 0 |
| 0.813888888888889 | 0 |
| 0.8145833333333333 | 0 |
| 0.8152777777777778 | 0 |
| 0.8159722222222222 | 0 |
| 0.8166666666666668 | 0 |
| 0.8173611111111111 | 0 |
| 0.8180555555555555 | 0 |
| 0.81875 | 0 |
| 0.8194444444444445 | 0 |
| 0.8201388888888889 | 0 |
| 0.8208333333333333 | 0 |
| 0.8215277777777777 | 0 |
| 0.8222222222222223 | 0 |
| 0.8229166666666666 | 0 |
| 0.8236111111111111 | 0 |
| 0.8243055555555556 | 0 |
| 0.8250000000000001 | 0 |
| 0.8256944444444444 | 0 |
| 0.8263888888888888 | 0 |
| 0.8270833333333334 | 0 |
| 0.8277777777777778 | 0 |
| 0.8284722222222222 | 0 |
| 0.8291666666666666 | 0 |
| 0.8298611111111112 | 0 |
| 0.8305555555555556 | 0 |
| 0.8312499999999999 | 0 |
| 0.8319444444444444 | 0 |
| 0.8326388888888889 | 0 |
| 0.8333333333333334 | 0 |
| 0.8340277777777777 | 0 |
| 0.8347222222222223 | 0 |
| 0.8354166666666667 | 0 |
| 0.8361111111111111 | 0 |
| 0.8368055555555555 | 0 |
| 0.8375 | 0 |
| 0.8381944444444445 | 0 |
| 0.8388888888888889 | 0 |
| 0.8395833333333332 | 0 |
| 0.8402777777777778 | 0 |
| 0.8409722222222222 | 0 |
| 0.8416666666666667 | 0 |
| 0.842361111111111 | 0 |
| 0.8430555555555556 | 0 |
| 0.84375 | 0 |
| 0.8444444444444444 | 0 |
| 0.845138888888889 | 0 |
| 0.8458333333333333 | 0 |
| 0.8465277777777778 | 0 |
| 0.8472222222222222 | 0 |
| 0.8479166666666668 | 0 |
| 0.8486111111111111 | 0 |
| 0.8493055555555555 | 0 |
| 0.85 | 0 |
| 0.8506944444444445 | 0 |
| 0.8513888888888889 | 0 |
| 0.8520833333333333 | 0 |
| 0.8527777777777777 | 0 |
| 0.8534722222222223 | 0 |
| 0.8541666666666666 | 0 |
| 0.8548611111111111 | 0 |
| 0.8555555555555556 | 0 |
| 0.8562500000000001 | 0 |
| 0.8569444444444444 | 0 |
| 0.8576388888888888 | 0 |
| 0.8583333333333334 | 0 |
| 0.8590277777777778 | 0 |
| 0.8597222222222222 | 0 |
| 0.8604166666666666 | 0 |
| 0.8611111111111112 | 0 |
| 0.8618055555555556 | 0 |
| 0.8624999999999999 | 0 |
| 0.8631944444444444 | 0 |
| 0.8638888888888889 | 0 |
| 0.8645833333333334 | 0 |
| 0.8652777777777777 | 0 |
| 0.8659722222222223 | 0 |
| 0.8666666666666667 | 0 |
| 0.8673611111111111 | 0 |
| 0.8680555555555555 | 0 |
| 0.86875 | 0 |
| 0.8694444444444445 | 0 |
| 0.8701388888888889 | 0 |
| 0.8708333333333332 | 0 |
| 0.8715277777777778 | 0 |
| 0.8722222222222222 | 0 |
| 0.8729166666666667 | 0 |
| 0.873611111111111 | 0 |
| 0.8743055555555556 | 0 |
| 0.875 | 0 |
| 0.8756944444444444 | 0 |
| 0.876388888888889 | 0 |
| 0.8770833333333333 | 0 |
| 0.8777777777777778 | 0 |
| 0.8784722222222222 | 0 |
| 0.8791666666666668 | 0 |
| 0.8798611111111111 | 0 |
| 0.8805555555555555 | 0 |
| 0.88125 | 0 |
| 0.8819444444444445 | 0 |
| 0.8826388888888889 | 0 |
| 0.8833333333333333 | 0 |
| 0.8840277777777777 | 0 |
| 0.8847222222222223 | 0 |
| 0.8854166666666666 | 0 |
| 0.8861111111111111 | 0 |
| 0.8868055555555556 | 0 |
| 0.8875000000000001 | 0 |
| 0.8881944444444444 | 0 |
| 0.8888888888888888 | 0 |
| 0.8895833333333334 | 0 |
| 0.8902777777777778 | 0 |
| 0.8909722222222222 | 0 |
| 0.8916666666666666 | 0 |
| 0.8923611111111112 | 0 |
| 0.8930555555555556 | 0 |
| 0.8937499999999999 | 0 |
| 0.8944444444444444 | 0 |
| 0.8951388888888889 | 0 |
| 0.8958333333333334 | 0 |
| 0.8965277777777777 | 0 |
| 0.8972222222222223 | 0 |
| 0.8979166666666667 | 0 |
| 0.8986111111111111 | 0 |
| 0.8993055555555555 | 0 |
| 0.9 | 0 |
| 0.9006944444444445 | 0 |
| 0.9013888888888889 | 0 |
| 0.9020833333333332 | 0 |
| 0.9027777777777778 | 0 |
| 0.9034722222222222 | 0 |
| 0.9041666666666667 | 0 |
| 0.904861111111111 | 0 |
| 0.9055555555555556 | 0 |
| 0.90625 | 0 |
| 0.9069444444444444 | 0 |
| 0.907638888888889 | 0 |
| 0.9083333333333333 | 0 |
| 0.9090277777777778 | 0 |
| 0.9097222222222222 | 0 |
| 0.9104166666666668 | 0 |
| 0.9111111111111111 | 0 |
| 0.9118055555555555 | 0 |
| 0.9125 | 0 |
| 0.9131944444444445 | 0 |
| 0.9138888888888889 | 0 |
| 0.9145833333333333 | 0 |
| 0.9152777777777777 | 0 |
| 0.9159722222222223 | 0 |
| 0.9166666666666666 | 0 |
| 0.9173611111111111 | 0 |
| 0.9180555555555556 | 0 |
| 0.9187500000000001 | 0 |
| 0.9194444444444444 | 0 |
| 0.9201388888888888 | 0 |
| 0.9208333333333334 | 0 |
| 0.9215277777777778 | 0 |
| 0.9222222222222222 | 0 |
| 0.9229166666666666 | 0 |
| 0.9236111111111112 | 0 |
| 0.9243055555555556 | 0 |
| 0.9249999999999999 | 0 |
| 0.9256944444444444 | 0 |
| 0.9263888888888889 | 0 |
| 0.9270833333333334 | 0 |
| 0.9277777777777777 | 0 |
| 0.9284722222222223 | 0 |
| 0.9291666666666667 | 0 |
| 0.9298611111111111 | 0 |
| 0.9305555555555555 | 0 |
| 0.93125 | 0 |
| 0.9319444444444445 | 0 |
| 0.9326388888888889 | 0 |
| 0.9333333333333332 | 0 |
| 0.9340277777777778 | 0 |
| 0.9347222222222222 | 0 |
| 0.9354166666666667 | 0 |
| 0.936111111111111 | 0 |
| 0.9368055555555556 | 0 |
| 0.9375 | 0 |
| 0.9381944444444444 | 0 |
| 0.938888888888889 | 0 |
| 0.9395833333333333 | 0 |
| 0.9402777777777778 | 0 |
| 0.9409722222222222 | 0 |
| 0.9416666666666668 | 0 |
| 0.9423611111111111 | 0 |
| 0.9430555555555555 | 0 |
| 0.94375 | 0 |
| 0.9444444444444445 | 0 |
| 0.9451388888888889 | 0 |
| 0.9458333333333333 | 0 |
| 0.9465277777777777 | 0 |
| 0.9472222222222223 | 0 |
| 0.9479166666666666 | 0 |
| 0.9486111111111111 | 0 |
| 0.9493055555555556 | 0 |
| 0.9500000000000001 | 0 |
| 0.9506944444444444 | 0 |
| 0.9513888888888888 | 0 |
| 0.9520833333333334 | 0 |
| 0.9527777777777778 | 0 |
| 0.9534722222222222 | 0 |
| 0.9541666666666666 | 0 |
| 0.9548611111111112 | 0 |
| 0.9555555555555556 | 0 |
| 0.9562499999999999 | 0 |
| 0.9569444444444444 | 0 |
| 0.9576388888888889 | 0 |
| 0.9583333333333334 | 0 |
| 0.9590277777777777 | 0 |
| 0.9597222222222223 | 0 |
| 0.9604166666666667 | 0 |
| 0.9611111111111111 | 0 |
| 0.9618055555555555 | 0 |
| 0.9625 | 0 |
| 0.9631944444444445 | 0 |
| 0.9638888888888889 | 0 |
| 0.9645833333333332 | 0 |
| 0.9652777777777778 | 0 |
| 0.9659722222222222 | 0 |
| 0.9666666666666667 | 0 |
| 0.967361111111111 | 0 |
| 0.9680555555555556 | 0 |
| 0.96875 | 0 |
| 0.9694444444444444 | 0 |
| 0.970138888888889 | 0 |
| 0.9708333333333333 | 0 |
| 0.9715277777777778 | 0 |
| 0.9722222222222222 | 0 |
| 0.9729166666666668 | 0 |
| 0.9736111111111111 | 0 |
| 0.9743055555555555 | 0 |
| 0.975 | 0 |
| 0.9756944444444445 | 0 |
| 0.9763888888888889 | 0 |
| 0.9770833333333333 | 0 |
| 0.9777777777777777 | 0 |
| 0.9784722222222223 | 0 |
| 0.9791666666666666 | 0 |
| 0.9798611111111111 | 0 |
| 0.9805555555555556 | 0 |
| 0.9812500000000001 | 0 |
| 0.9819444444444444 | 0 |
| 0.9826388888888888 | 0 |
| 0.9833333333333334 | 0 |
| 0.9840277777777778 | 0 |
| 0.9847222222222222 | 0 |
| 0.9854166666666666 | 0 |
| 0.9861111111111112 | 0 |
| 0.9868055555555556 | 0 |
| 0.9874999999999999 | 0 |
| 0.9881944444444444 | 0 |
| 0.9888888888888889 | 0 |
| 0.9895833333333334 | 0 |
| 0.9902777777777777 | 0 |
| 0.9909722222222223 | 0 |
| 0.9916666666666667 | 0 |
| 0.9923611111111111 | 0 |
| 0.9930555555555555 | 0 |
| 0.99375 | 0 |
| 0.9944444444444445 | 0 |
| 0.9951388888888889 | 0 |
| 0.9958333333333332 | 0 |
| 0.9965277777777778 | 0 |
| 0.9972222222222222 | 0 |
| 0.9979166666666667 | 0 |
| 0.998611111111111 | 0 |
| 0.9993055555555556 | 0 |